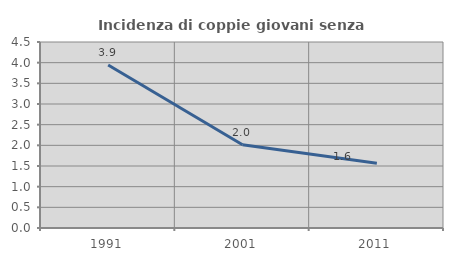
| Category | Incidenza di coppie giovani senza figli |
|---|---|
| 1991.0 | 3.943 |
| 2001.0 | 2.013 |
| 2011.0 | 1.569 |